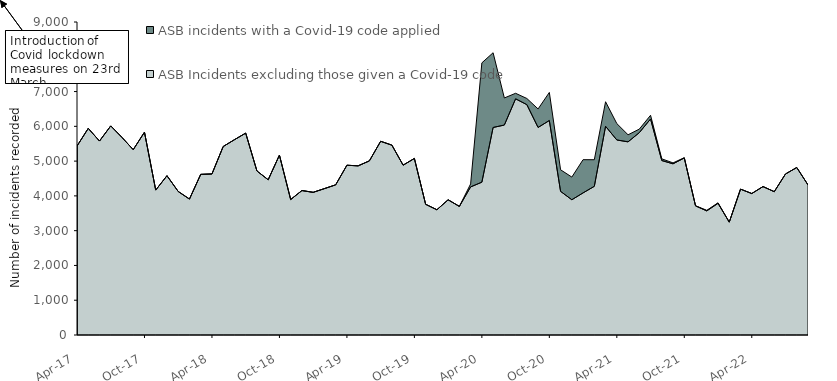
| Category | ASB Incidents excluding those given a Covid-19 code | ASB incidents with a Covid-19 code applied |
|---|---|---|
| 2017-04-01 | 5433 | 0 |
| 2017-05-01 | 5941 | 0 |
| 2017-06-01 | 5577 | 0 |
| 2017-07-01 | 6012 | 0 |
| 2017-08-01 | 5681 | 0 |
| 2017-09-01 | 5329 | 0 |
| 2017-10-01 | 5832 | 0 |
| 2017-11-01 | 4167 | 0 |
| 2017-12-01 | 4580 | 0 |
| 2018-01-01 | 4127 | 0 |
| 2018-02-01 | 3909 | 0 |
| 2018-03-01 | 4619 | 0 |
| 2018-04-01 | 4631 | 0 |
| 2018-05-01 | 5420 | 0 |
| 2018-06-01 | 5616 | 0 |
| 2018-07-01 | 5805 | 0 |
| 2018-08-01 | 4716 | 0 |
| 2018-09-01 | 4464 | 0 |
| 2018-10-01 | 5172 | 0 |
| 2018-11-01 | 3896 | 0 |
| 2018-12-01 | 4154 | 0 |
| 2019-01-01 | 4102 | 0 |
| 2019-02-01 | 4209 | 0 |
| 2019-03-01 | 4318 | 0 |
| 2019-04-01 | 4881 | 0 |
| 2019-05-01 | 4864 | 0 |
| 2019-06-01 | 5007 | 0 |
| 2019-07-01 | 5570 | 0 |
| 2019-08-01 | 5459 | 0 |
| 2019-09-01 | 4884 | 0 |
| 2019-10-01 | 5076 | 0 |
| 2019-11-01 | 3759 | 0 |
| 2019-12-01 | 3601 | 0 |
| 2020-01-01 | 3888 | 0 |
| 2020-02-01 | 3698 | 0 |
| 2020-03-01 | 4258 | 86 |
| 2020-04-01 | 4394 | 3431 |
| 2020-05-01 | 5967 | 2149 |
| 2020-06-01 | 6037 | 779 |
| 2020-07-01 | 6791 | 159 |
| 2020-08-01 | 6624 | 177 |
| 2020-09-01 | 5968 | 532 |
| 2020-10-01 | 6167 | 808 |
| 2020-11-01 | 4130 | 621 |
| 2020-12-01 | 3889 | 652 |
| 2021-01-01 | 4086 | 955 |
| 2021-02-01 | 4275 | 765 |
| 2021-03-01 | 6001 | 706 |
| 2021-04-01 | 5608 | 471 |
| 2021-05-01 | 5554 | 203 |
| 2021-06-01 | 5818 | 102 |
| 2021-07-01 | 6211 | 107 |
| 2021-08-01 | 5016 | 49 |
| 2021-09-01 | 4922 | 27 |
| 2021-10-01 | 5090 | 9 |
| 2021-11-01 | 3712 | 5 |
| 2021-12-01 | 3569 | 16 |
| 2022-01-01 | 3786 | 16 |
| 2022-02-01 | 3245 | 1 |
| 2022-03-01 | 4194 | 1 |
| 2022-04-01 | 4068 | 0 |
| 2022-05-01 | 4268 | 0 |
| 2022-06-01 | 4121 | 0 |
| 2022-07-01 | 4630 | 0 |
| 2022-08-01 | 4816 | 0 |
| 2022-09-01 | 4315 | 1 |